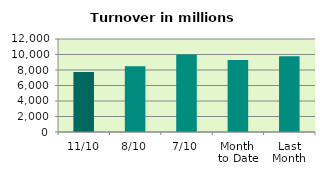
| Category | Series 0 |
|---|---|
| 11/10 | 7746.895 |
| 8/10 | 8478.071 |
| 7/10 | 9987.215 |
| Month 
to Date | 9286.983 |
| Last
Month | 9769.37 |